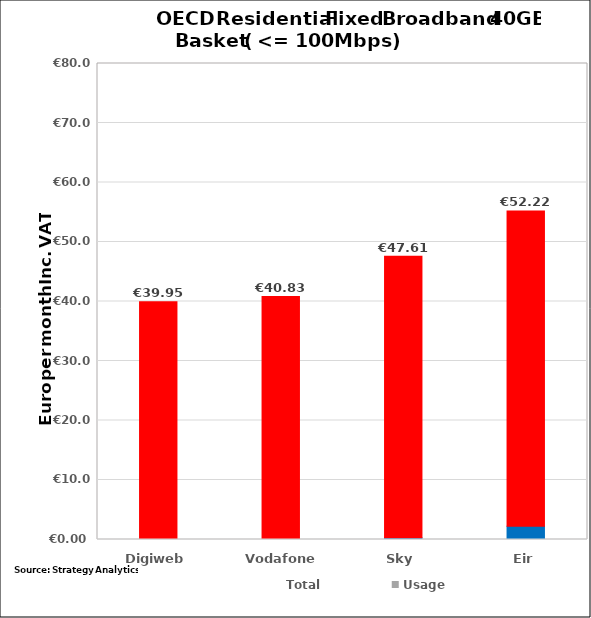
| Category | Non-rec | Monthly | Usage | Total |
|---|---|---|---|---|
| Digiweb | 0 | 39.95 | 0 | 39.95 |
| Vodafone  | 0 | 40.833 | 0 | 40.833 |
| Sky | 0.278 | 47.33 | 0 | 47.61 |
| Eir | 2.23 | 52.99 | 0 | 52.22 |